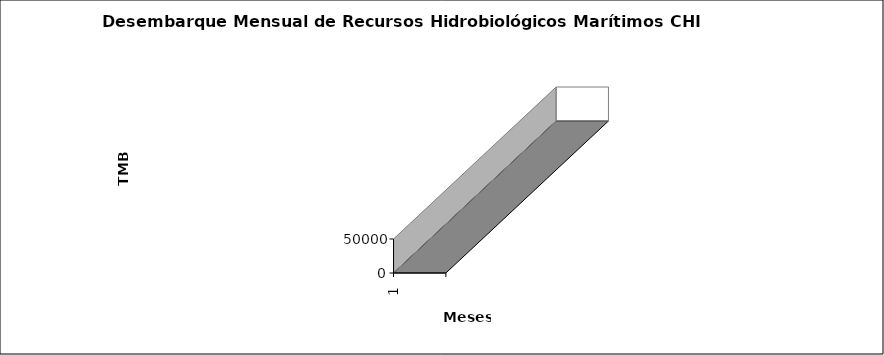
| Category | ENE | FEB | MAR | ABR | MAY | JUN | JUL | AGO | SET | OCT | NOV | DIC |
|---|---|---|---|---|---|---|---|---|---|---|---|---|
| 0 | 1881.17 | 43508.18 | 30363.16 | 23518.72 | 2152.83 | 3621.03 | 20717.43 | 11721.6 | 460.35 | 578.13 | 771.78 | 3077.49 |